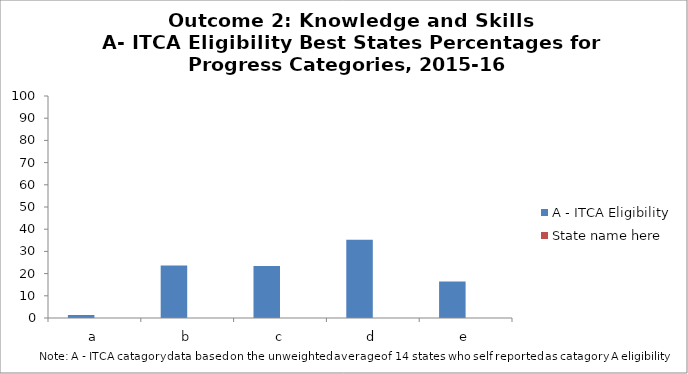
| Category | A - ITCA Eligibility | State name here |
|---|---|---|
| a | 1.34 |  |
| b | 23.6 |  |
| c | 23.4 |  |
| d | 35.3 |  |
| e | 16.4 |  |